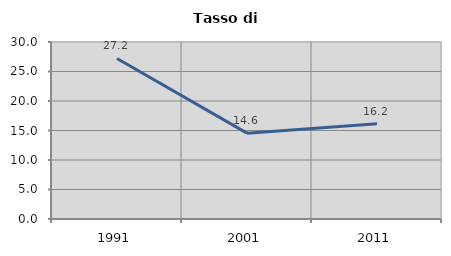
| Category | Tasso di disoccupazione   |
|---|---|
| 1991.0 | 27.216 |
| 2001.0 | 14.551 |
| 2011.0 | 16.157 |